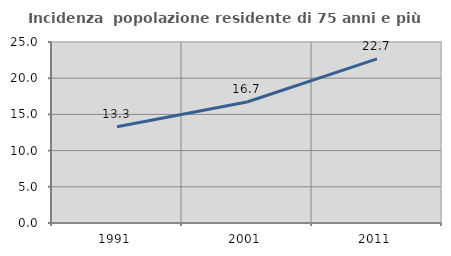
| Category | Incidenza  popolazione residente di 75 anni e più |
|---|---|
| 1991.0 | 13.29 |
| 2001.0 | 16.709 |
| 2011.0 | 22.674 |